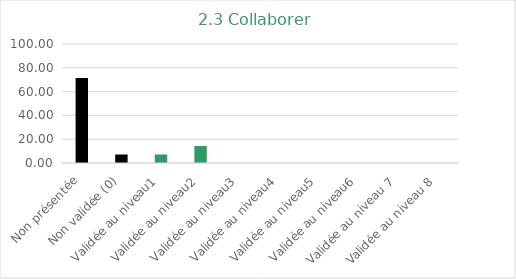
| Category | Series 0 |
|---|---|
| Non présentée | 71.429 |
| Non validée (0) | 7.143 |
| Validée au niveau1 | 7.143 |
| Validée au niveau2 | 14.286 |
| Validée au niveau3 | 0 |
| Validée au niveau4 | 0 |
| Validée au niveau5 | 0 |
| Validée au niveau6 | 0 |
| Validée au niveau 7 | 0 |
| Validée au niveau 8 | 0 |